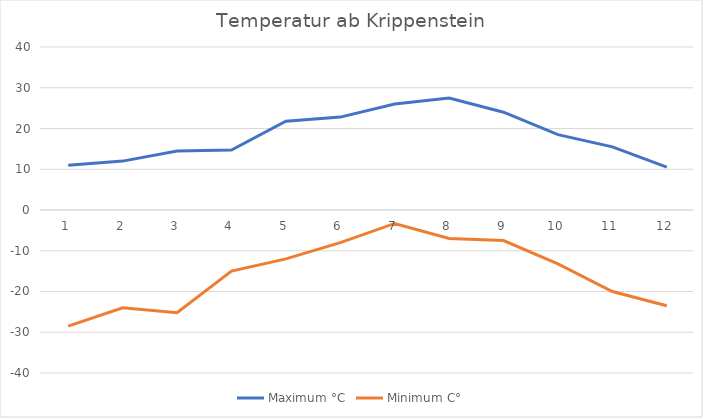
| Category | Maximum °C | Minimum C° |
|---|---|---|
| 0 | 11 | -28.5 |
| 1 | 12 | -24 |
| 2 | 14.5 | -25.2 |
| 3 | 14.7 | -15 |
| 4 | 21.8 | -12 |
| 5 | 22.8 | -8 |
| 6 | 26 | -3.3 |
| 7 | 27.5 | -7 |
| 8 | 24 | -7.5 |
| 9 | 18.5 | -13.2 |
| 10 | 15.5 | -20 |
| 11 | 10.5 | -23.5 |